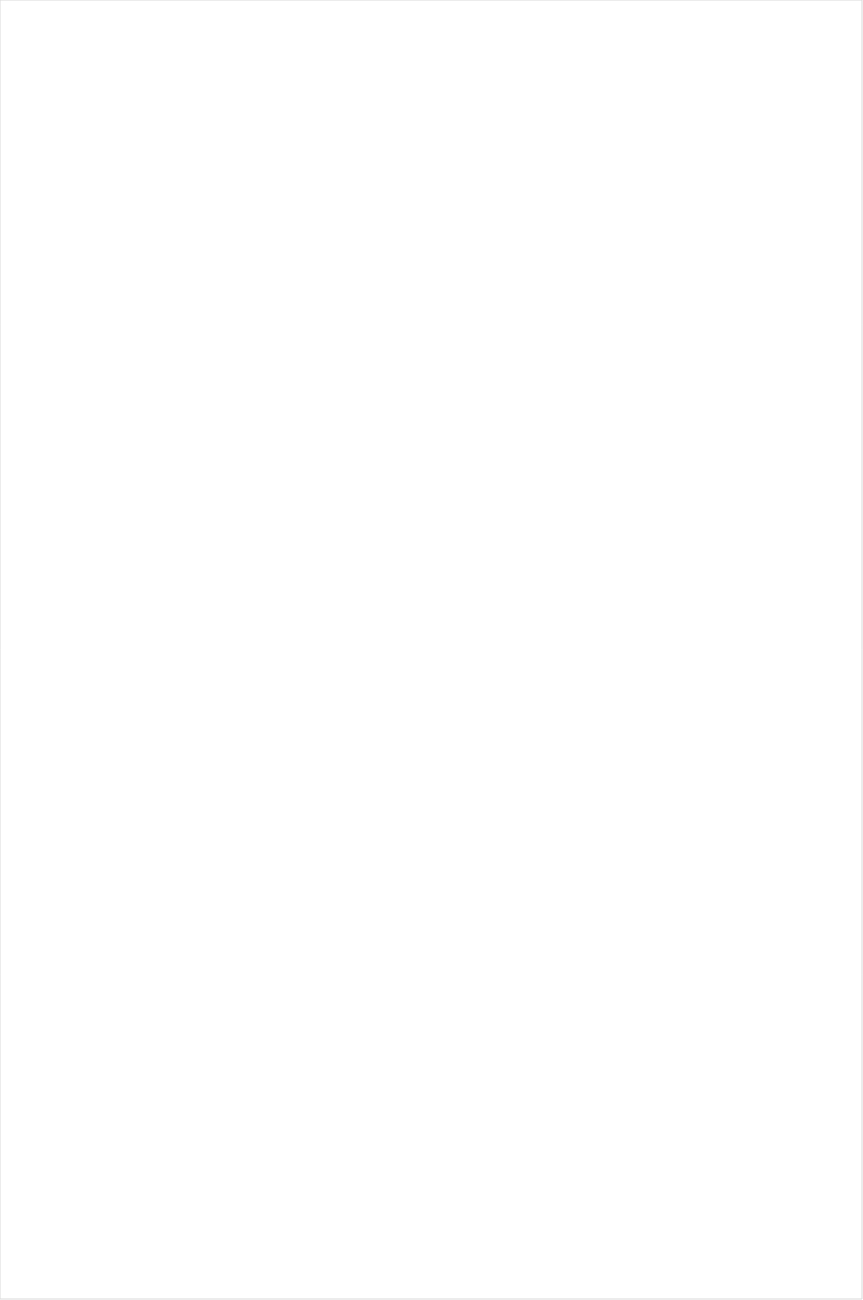
| Category | Total |
|---|---|
| BET | -0.558 |
| BET Her | -0.529 |
| TV ONE | -0.515 |
| VH1 | -0.453 |
| Lifetime Movies | -0.449 |
| Cartoon Network | -0.426 |
| Oprah Winfrey Network | -0.423 |
| UniMas | -0.369 |
| Disney Channel | -0.298 |
| TLC | -0.294 |
| UP TV | -0.285 |
| Telemundo | -0.285 |
| Nick | -0.279 |
| Disney XD | -0.277 |
| WE TV | -0.256 |
| Nick Toons | -0.246 |
| MyNetworkTV | -0.244 |
| Adult Swim | -0.24 |
| Univision | -0.238 |
| Travel | -0.236 |
| Teen Nick | -0.226 |
| Galavision | -0.223 |
| Lifetime | -0.221 |
| Hallmark | -0.202 |
| Nick Jr. | -0.185 |
| Discovery Life Channel | -0.171 |
| ION | -0.145 |
| TUDN | -0.14 |
| Hallmark Movies & Mysteries | -0.123 |
| Logo | -0.122 |
| Disney Junior US | -0.122 |
| Investigation Discovery | -0.121 |
| Discovery Family Channel | -0.11 |
| NBC Universo | -0.106 |
| Universal Kids | -0.09 |
| OXYGEN | -0.089 |
| BRAVO | -0.089 |
| MTV2 | -0.069 |
| CMTV | -0.049 |
| CW | -0.048 |
| SYFY | -0.038 |
| Great American Country | -0.034 |
| E! | -0.015 |
| Nick@Nite | 0.001 |
| A&E | 0.01 |
| PBS | 0.023 |
| Freeform | 0.025 |
| Ovation | 0.028 |
| POP | 0.029 |
| Discovery Channel | 0.049 |
| FX | 0.05 |
| MTV | 0.05 |
| Animal Planet | 0.056 |
| INSP | 0.057 |
| FOX | 0.06 |
| Motor Trend Network | 0.06 |
| NBC | 0.063 |
| HGTV | 0.064 |
| CBS | 0.074 |
| FXX | 0.096 |
| Headline News | 0.101 |
| Science Channel | 0.104 |
| USA Network | 0.113 |
| ABC | 0.116 |
| TBS | 0.165 |
| Weather Channel | 0.176 |
| FX Movie Channel | 0.191 |
| TNT | 0.208 |
| National Geographic Wild | 0.223 |
| MSNBC | 0.24 |
| Reelz Channel | 0.248 |
| Food Network | 0.253 |
| National Geographic | 0.259 |
| TV LAND | 0.271 |
| WGN America | 0.272 |
| Paramount Network | 0.287 |
| BBC America | 0.291 |
| FYI | 0.293 |
| CNN | 0.316 |
| Destination America | 0.325 |
| History Channel | 0.327 |
| Viceland | 0.331 |
| DIY | 0.334 |
| SundanceTV | 0.353 |
| AMC | 0.359 |
| American Heroes Channel | 0.37 |
| Comedy Central | 0.373 |
| Fox News | 0.413 |
| Fox Business | 0.418 |
| Cooking Channel | 0.423 |
| RFD TV | 0.431 |
| Game Show | 0.434 |
| Smithsonian | 0.448 |
| Bloomberg HD | 0.464 |
| CNBC | 0.47 |
| Olympic Channel | 0.474 |
| truTV | 0.486 |
| Independent Film (IFC) | 0.563 |
| Outdoor Channel | 0.674 |
| The Sportsman Channel | 0.717 |
| Tennis Channel | 0.994 |
| NBC Sports | 1.119 |
| ESPN Deportes | 1.126 |
| FXDEP | 1.189 |
| Fox Sports 1 | 1.427 |
| Big Ten Network | 1.476 |
| NFL Network | 1.519 |
| FOX Sports 2 | 1.557 |
| CBS Sports | 1.573 |
| ESPNEWS | 1.675 |
| NBA TV | 1.71 |
| Golf | 2.063 |
| ESPN | 2.143 |
| ESPN2 | 2.403 |
| ESPNU | 2.631 |
| PAC-12 Network | 2.904 |
| NHL | 2.92 |
| MLB Network | 5.842 |